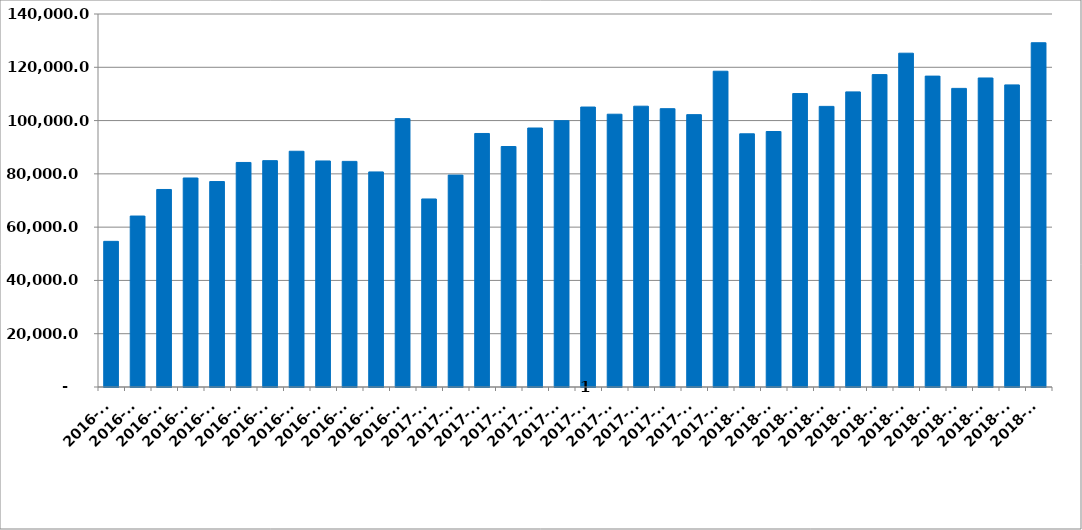
| Category | ფულადი გზავნილები სულ |
|---|---|
| 2016-01 | 54668.843 |
| 2016-02 | 64166.493 |
| 2016-03 | 74135.096 |
| 2016-04 | 78445.112 |
| 2016-05 | 77110.878 |
| 2016-06 | 84274.721 |
| 2016-07 | 84960.145 |
| 2016-08 | 88481.217 |
| 2016-09 | 84837.493 |
| 2016-10 | 84680.75 |
| 2016-11 | 80721.619 |
| 2016-12 | 100726.99 |
| 2017-01 | 70579.425 |
| 2017-02 | 79529.997 |
| 2017-03 | 95158.098 |
| 2017-04 | 90258.382 |
| 2017-05 | 97211.593 |
| 2017-06 | 99965.514 |
| 2017-07 | 105079.971 |
| 2017-08 | 102386.889 |
| 2017-09 | 105398.216 |
| 2017-10 | 104465.995 |
| 2017-11 | 102226.413 |
| 2017-12 | 118523.565 |
| 2018-01 | 95034.354 |
| 2018-02 | 95897.356 |
| 2018-03 | 110142.866 |
| 2018-04 | 105325.787 |
| 2018-05 | 110766.778 |
| 2018-06 | 117254.207 |
| 2018-07 | 125290.436 |
| 2018-08 | 116687.805 |
| 2018-09 | 112082.017 |
| 2018-10 | 115990.263 |
| 2018-11 | 113389.599 |
| 2018-12 | 129213.287 |